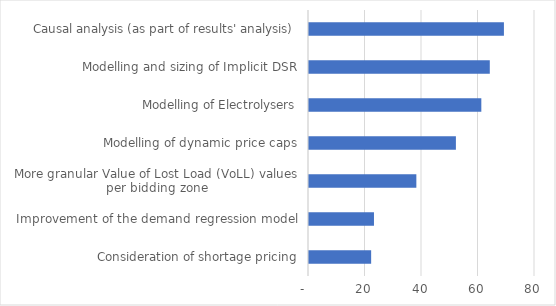
| Category | Priority score (highest = high priority) |
|---|---|
| Consideration of shortage pricing | 22 |
| Improvement of the demand regression model | 23 |
| More granular Value of Lost Load (VoLL) values per bidding zone | 38 |
| Modelling of dynamic price caps | 52 |
| Modelling of Electrolysers | 61 |
| Modelling and sizing of Implicit DSR | 64 |
| Causal analysis (as part of results' analysis) | 69 |